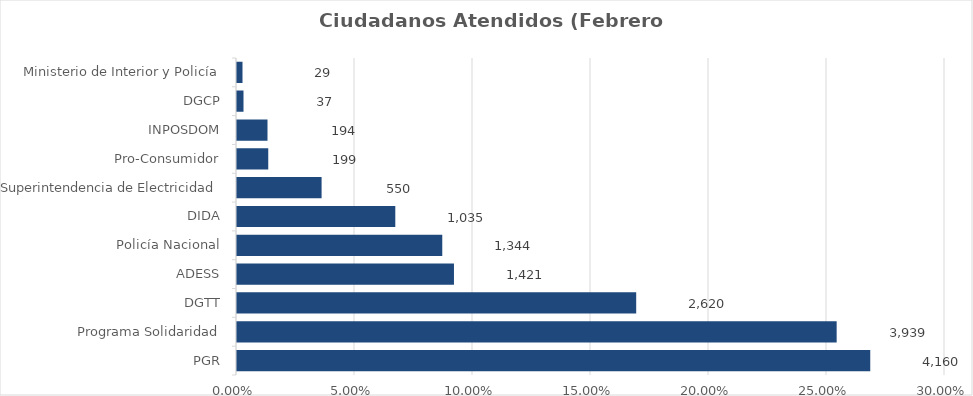
| Category | Porcentaje |
|---|---|
| PGR | 0.268 |
| Programa Solidaridad | 0.254 |
| DGTT | 0.169 |
| ADESS | 0.092 |
| Policía Nacional | 0.087 |
| DIDA | 0.067 |
| Superintendencia de Electricidad | 0.035 |
| Pro-Consumidor | 0.013 |
| INPOSDOM | 0.012 |
| DGCP | 0.002 |
| Ministerio de Interior y Policía | 0.002 |